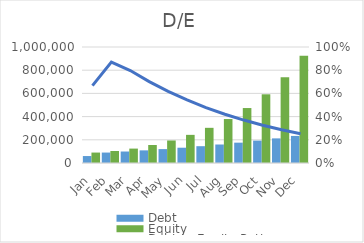
| Category | Debt | Equity |
|---|---|---|
| Jan | 60000 | 90000 |
| Feb | 90000 | 103500 |
| Mar | 99000 | 124200 |
| Apr | 108900 | 155250 |
| May | 119790 | 194062.5 |
| Jun | 131769 | 242578.125 |
| Jul | 144945.9 | 303222.656 |
| Aug | 159440.49 | 379028.32 |
| Sep | 175384.539 | 473785.4 |
| Oct | 192922.993 | 592231.75 |
| Nov | 212215.292 | 740289.688 |
| Dec | 233436.821 | 925362.11 |